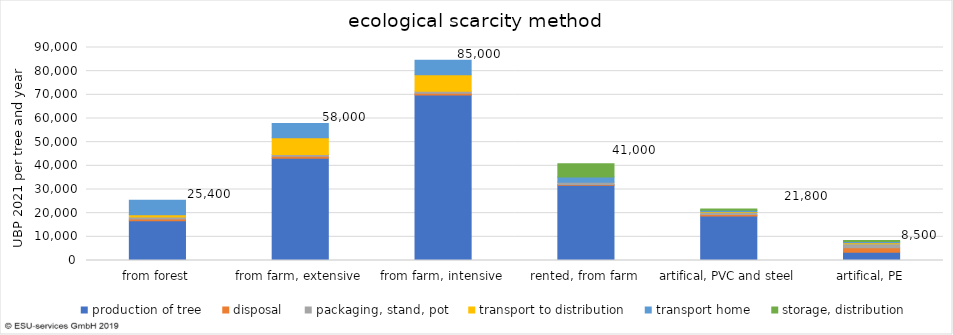
| Category | production of tree | disposal | packaging, stand, pot | transport to distribution | transport home | storage, distribution |
|---|---|---|---|---|---|---|
| from forest | 16754.09 | 808.442 | 804.23 | 1016.503 | 6050 | 0 |
| from farm, extensive | 43211.043 | 808.442 | 804.23 | 7013.869 | 6050 | 0 |
| from farm, intensive | 69904.955 | 808.442 | 804.23 | 7013.869 | 6050 | 0 |
| rented, from farm | 31776.457 | 378.997 | 883.357 | 0 | 2282.464 | 5529.554 |
| artifical, PVC and steel | 18803.022 | 590.779 | 908.927 | 329.237 | 605 | 527.333 |
| artifical, PE | 3537.233 | 1862.115 | 1672.225 | 387.338 | 605 | 395.5 |